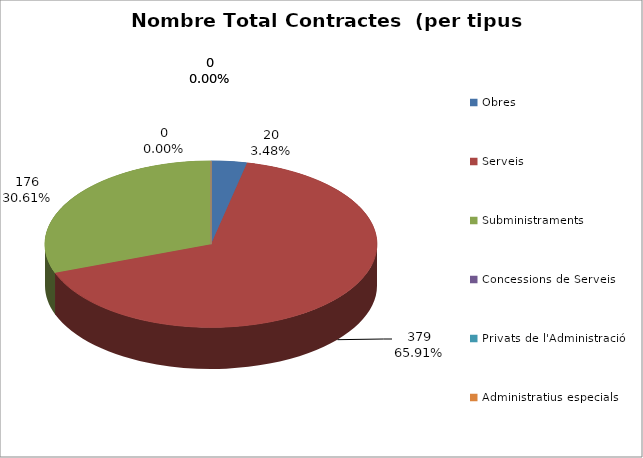
| Category | Nombre Total Contractes |
|---|---|
| Obres | 20 |
| Serveis | 379 |
| Subministraments | 176 |
| Concessions de Serveis | 0 |
| Privats de l'Administració | 0 |
| Administratius especials | 0 |